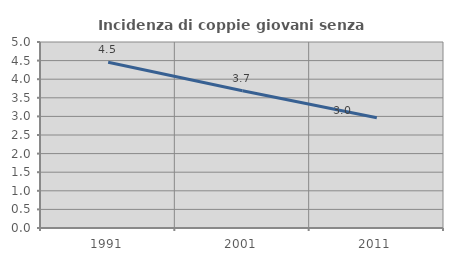
| Category | Incidenza di coppie giovani senza figli |
|---|---|
| 1991.0 | 4.455 |
| 2001.0 | 3.688 |
| 2011.0 | 2.963 |